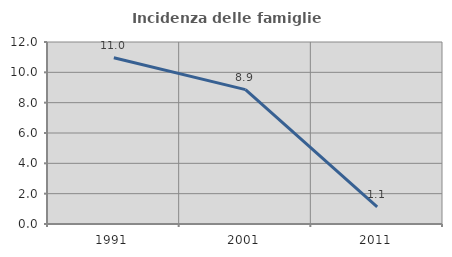
| Category | Incidenza delle famiglie numerose |
|---|---|
| 1991.0 | 10.959 |
| 2001.0 | 8.861 |
| 2011.0 | 1.136 |